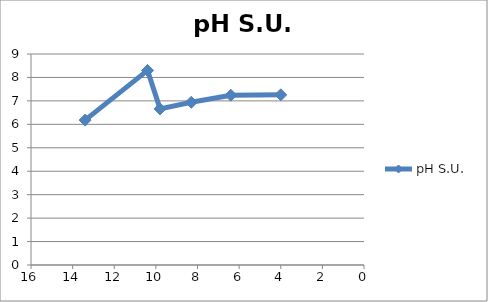
| Category | pH S.U.  |
|---|---|
| 13.4 | 6.18 |
| 10.4 | 8.3 |
| 9.8 | 6.66 |
| 8.3 | 6.94 |
| 6.4 | 7.24 |
| 4.0 | 7.26 |